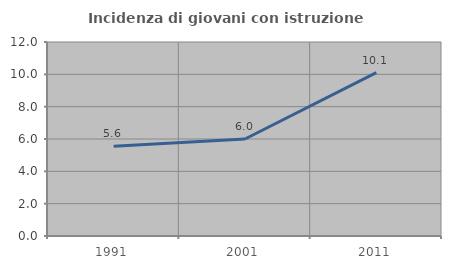
| Category | Incidenza di giovani con istruzione universitaria |
|---|---|
| 1991.0 | 5.556 |
| 2001.0 | 6 |
| 2011.0 | 10.101 |